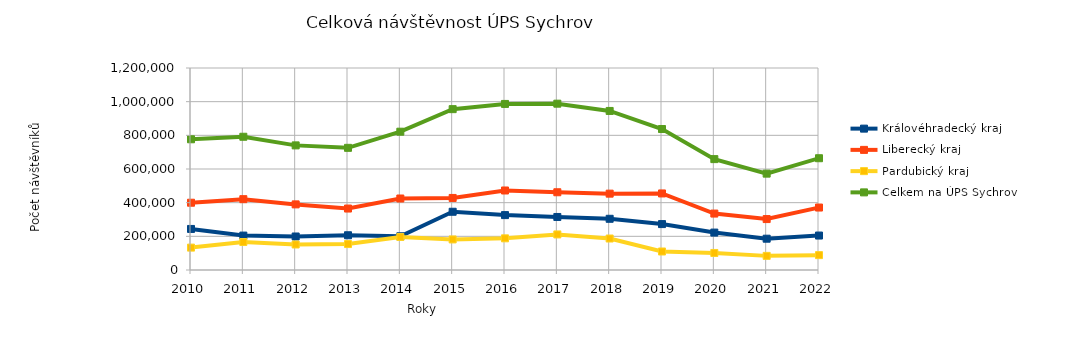
| Category | Královéhradecký kraj | Liberecký kraj | Pardubický kraj | Celkem na ÚPS Sychrov |
|---|---|---|---|---|
| 2010.0 | 243910 | 399672 | 133004 | 776586 |
| 2011.0 | 204481 | 420780 | 166238 | 791499 |
| 2012.0 | 199025 | 389781 | 151509 | 740315 |
| 2013.0 | 206419 | 365108 | 154165 | 725692 |
| 2014.0 | 200438 | 424718 | 196473 | 821629 |
| 2015.0 | 345970 | 428023 | 181567 | 955560 |
| 2016.0 | 326137 | 472318 | 188108 | 986563 |
| 2017.0 | 314983 | 461803 | 211268 | 988054 |
| 2018.0 | 304267 | 453568 | 187017 | 944852 |
| 2019.0 | 272720 | 454785 | 109949 | 837454 |
| 2020.0 | 222238 | 335261 | 101211 | 658710 |
| 2021.0 | 185934 | 302574 | 83925 | 572433 |
| 2022.0 | 204678 | 371041 | 88282 | 664001 |